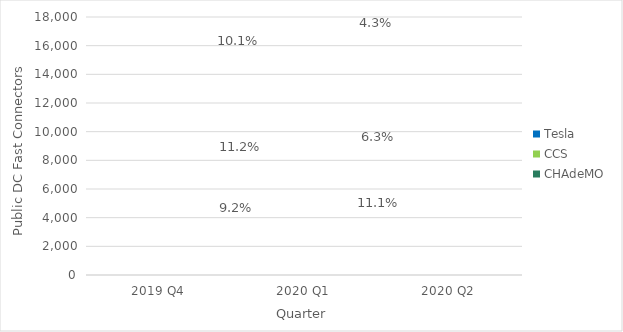
| Category | CHAdeMO | CCS | Tesla |
|---|---|---|---|
| 2019 Q4 | 0 | 0 | 0 |
| 2020 Q1 | 0 | 0 | 0 |
| 2020 Q2 | 0 | 0 | 0 |